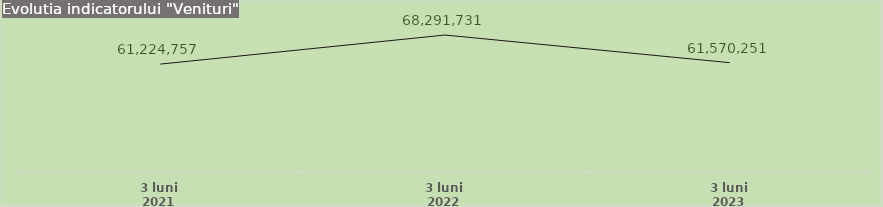
| Category | Series 1 |
|---|---|
| 3 luni 2021 | 61224757 |
| 3 luni 2022 | 68291731.2 |
| 3 luni 2023 | 61570251 |